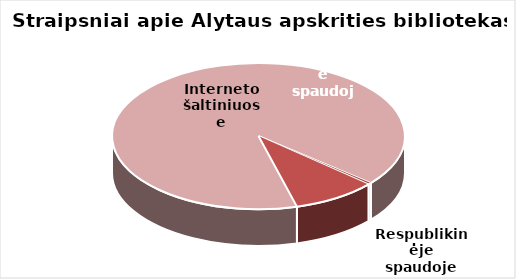
| Category | Series 0 |
|---|---|
| Respublikinėje spaudoje | 8 |
| Vietinėje spaudoje | 198 |
| Interneto šaltiniuose | 1925 |